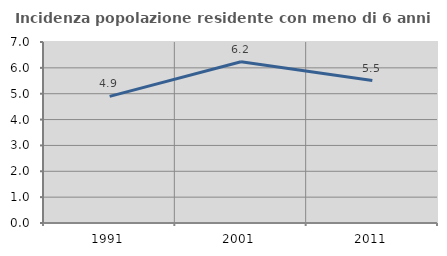
| Category | Incidenza popolazione residente con meno di 6 anni |
|---|---|
| 1991.0 | 4.897 |
| 2001.0 | 6.236 |
| 2011.0 | 5.507 |